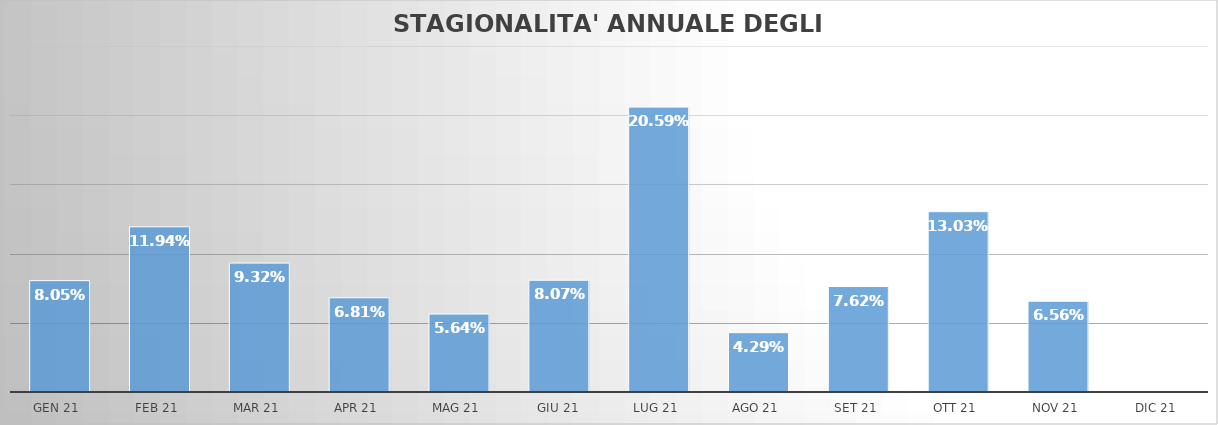
| Category | Series 0 |
|---|---|
|  GEN 21   | 0.08 |
|  FEB 21   | 0.119 |
|  MAR 21   | 0.093 |
|  APR 21   | 0.068 |
|  MAG 21   | 0.056 |
|  GIU 21  | 0.081 |
|  LUG 21   | 0.206 |
|  AGO 21   | 0.043 |
|  SET 21   | 0.076 |
|  OTT 21   | 0.13 |
|  NOV 21   | 0.066 |
|  DIC 21   | 0 |